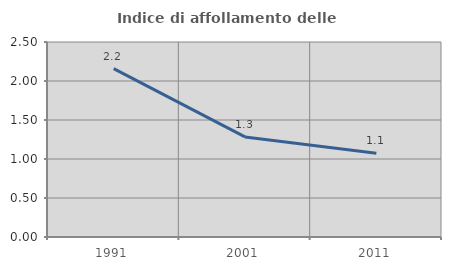
| Category | Indice di affollamento delle abitazioni  |
|---|---|
| 1991.0 | 2.158 |
| 2001.0 | 1.283 |
| 2011.0 | 1.074 |